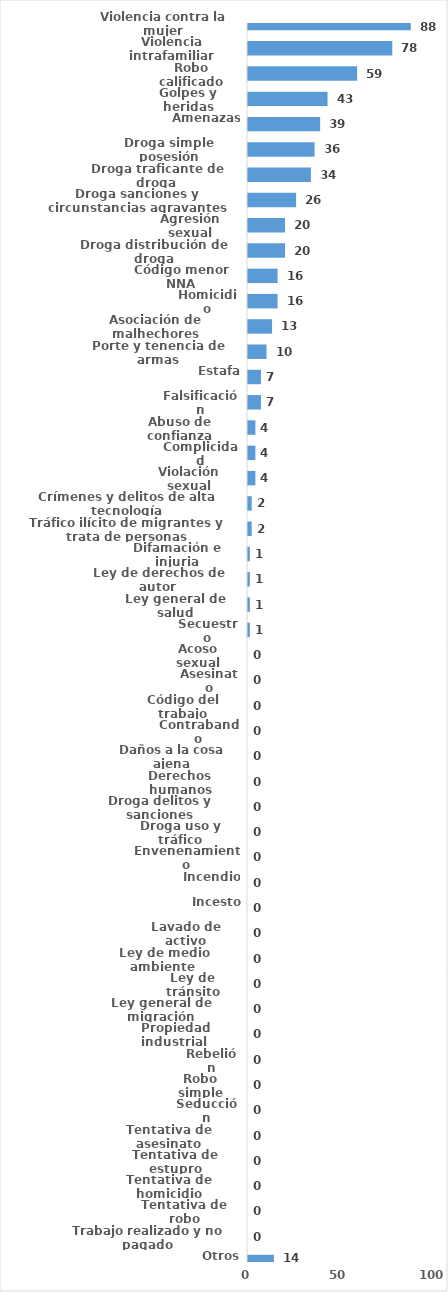
| Category | Series 0 |
|---|---|
| Violencia contra la mujer | 88 |
| Violencia intrafamiliar | 78 |
| Robo calificado | 59 |
| Golpes y heridas | 43 |
| Amenazas | 39 |
| Droga simple posesión | 36 |
| Droga traficante de droga  | 34 |
| Droga sanciones y circunstancias agravantes | 26 |
| Agresión sexual | 20 |
| Droga distribución de droga | 20 |
| Código menor NNA | 16 |
| Homicidio | 16 |
| Asociación de malhechores | 13 |
| Porte y tenencia de armas | 10 |
| Estafa | 7 |
| Falsificación | 7 |
| Abuso de confianza | 4 |
| Complicidad | 4 |
| Violación sexual | 4 |
| Crímenes y delitos de alta tecnología | 2 |
| Tráfico ilícito de migrantes y trata de personas | 2 |
| Difamación e injuria | 1 |
| Ley de derechos de autor  | 1 |
| Ley general de salud | 1 |
| Secuestro | 1 |
| Acoso sexual | 0 |
| Asesinato | 0 |
| Código del trabajo | 0 |
| Contrabando | 0 |
| Daños a la cosa ajena | 0 |
| Derechos humanos | 0 |
| Droga delitos y sanciones | 0 |
| Droga uso y tráfico | 0 |
| Envenenamiento | 0 |
| Incendio | 0 |
| Incesto | 0 |
| Lavado de activo | 0 |
| Ley de medio ambiente  | 0 |
| Ley de tránsito | 0 |
| Ley general de migración | 0 |
| Propiedad industrial  | 0 |
| Rebelión | 0 |
| Robo simple | 0 |
| Seducción | 0 |
| Tentativa de asesinato | 0 |
| Tentativa de estupro | 0 |
| Tentativa de homicidio | 0 |
| Tentativa de robo | 0 |
| Trabajo realizado y no pagado | 0 |
| Otros | 14 |